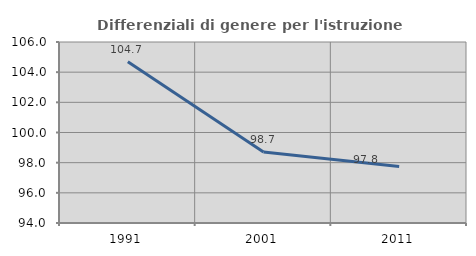
| Category | Differenziali di genere per l'istruzione superiore |
|---|---|
| 1991.0 | 104.687 |
| 2001.0 | 98.706 |
| 2011.0 | 97.751 |